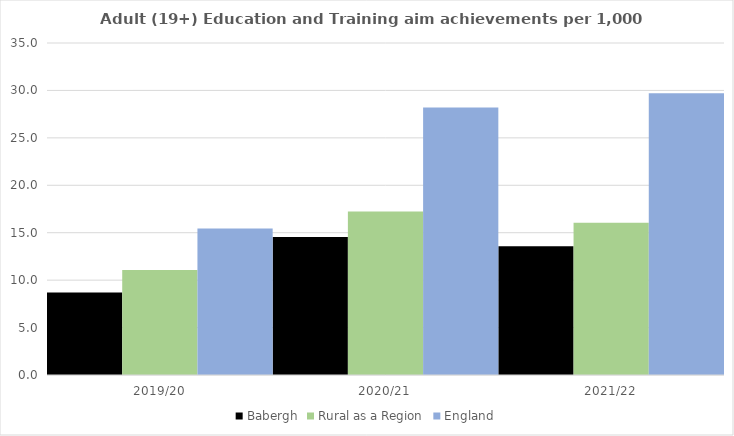
| Category | Babergh | Rural as a Region | England |
|---|---|---|---|
| 2019/20 | 8.71 | 11.081 | 15.446 |
| 2020/21 | 14.558 | 17.224 | 28.211 |
| 2021/22 | 13.583 | 16.063 | 29.711 |